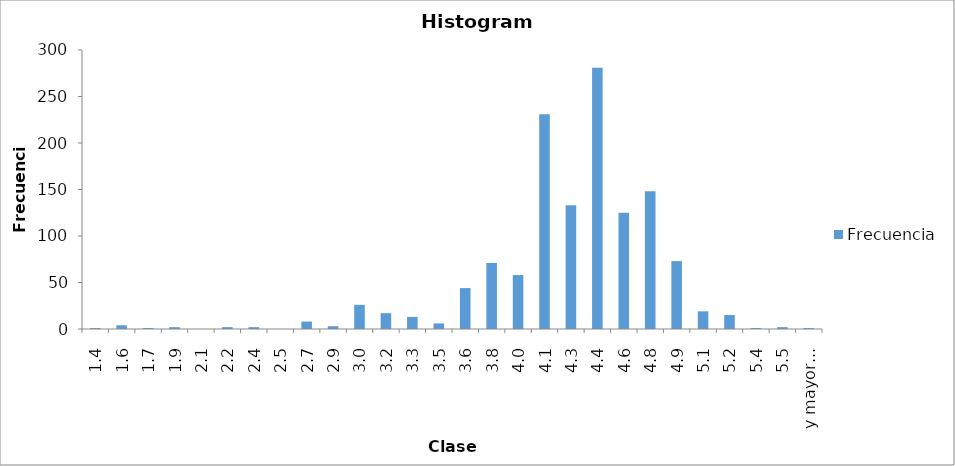
| Category | Frecuencia |
|---|---|
| 1,4 | 1 |
| 1,6 | 4 |
| 1,7 | 1 |
| 1,9 | 2 |
| 2,1 | 0 |
| 2,2 | 2 |
| 2,4 | 2 |
| 2,5 | 0 |
| 2,7 | 8 |
| 2,9 | 3 |
| 3,0 | 26 |
| 3,2 | 17 |
| 3,3 | 13 |
| 3,5 | 6 |
| 3,6 | 44 |
| 3,8 | 71 |
| 4,0 | 58 |
| 4,1 | 231 |
| 4,3 | 133 |
| 4,4 | 281 |
| 4,6 | 125 |
| 4,8 | 148 |
| 4,9 | 73 |
| 5,1 | 19 |
| 5,2 | 15 |
| 5,4 | 1 |
| 5,5 | 2 |
| y mayor... | 1 |